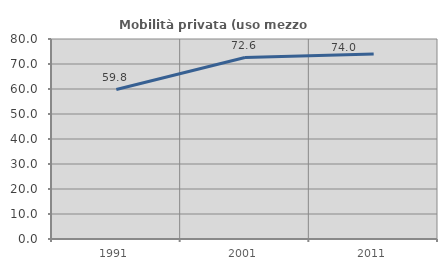
| Category | Mobilità privata (uso mezzo privato) |
|---|---|
| 1991.0 | 59.794 |
| 2001.0 | 72.581 |
| 2011.0 | 73.988 |